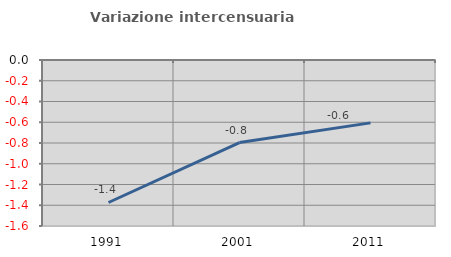
| Category | Variazione intercensuaria annua |
|---|---|
| 1991.0 | -1.373 |
| 2001.0 | -0.796 |
| 2011.0 | -0.606 |